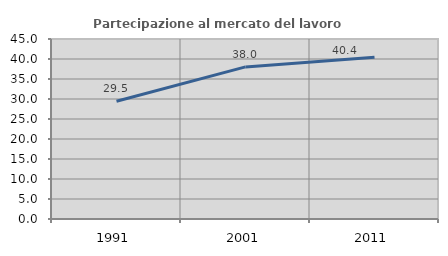
| Category | Partecipazione al mercato del lavoro  femminile |
|---|---|
| 1991.0 | 29.455 |
| 2001.0 | 38.028 |
| 2011.0 | 40.441 |